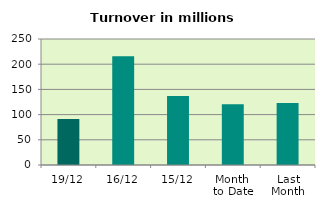
| Category | Series 0 |
|---|---|
| 19/12 | 91.31 |
| 16/12 | 215.682 |
| 15/12 | 136.753 |
| Month 
to Date | 120.5 |
| Last
Month | 122.873 |